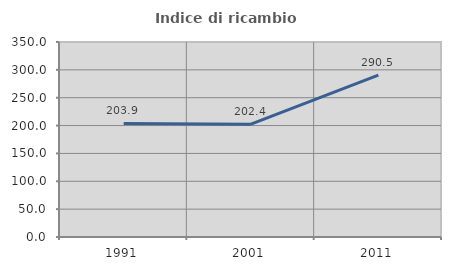
| Category | Indice di ricambio occupazionale  |
|---|---|
| 1991.0 | 203.922 |
| 2001.0 | 202.439 |
| 2011.0 | 290.476 |